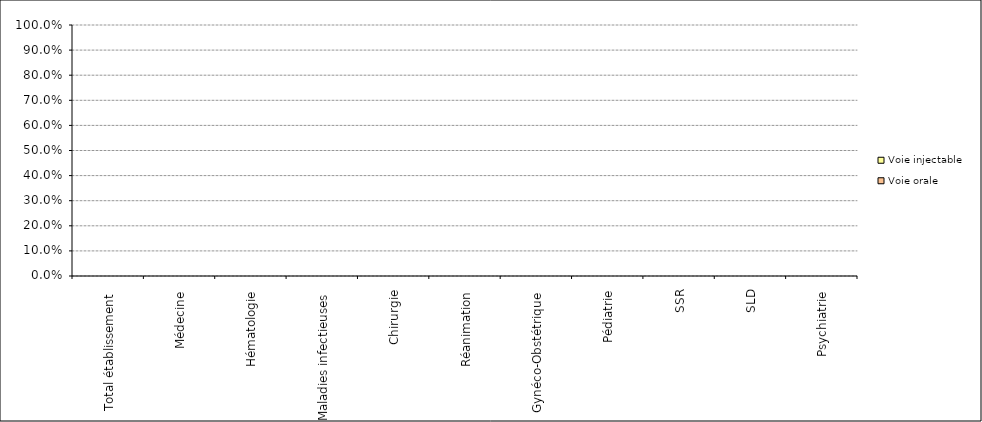
| Category | Voie orale | Voie injectable |
|---|---|---|
| Total établissement | 0 | 0 |
| Médecine | 0 | 0 |
| Hématologie | 0 | 0 |
| Maladies infectieuses | 0 | 0 |
| Chirurgie | 0 | 0 |
| Réanimation | 0 | 0 |
| Gynéco-Obstétrique | 0 | 0 |
| Pédiatrie | 0 | 0 |
| SSR | 0 | 0 |
| SLD | 0 | 0 |
| Psychiatrie | 0 | 0 |